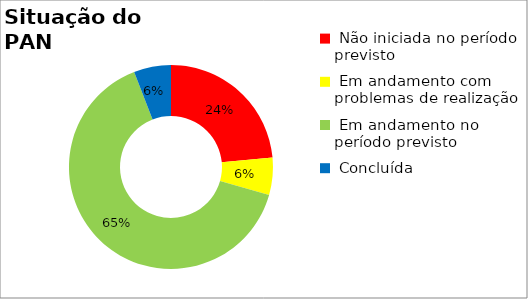
| Category | Series 0 |
|---|---|
|  Início planejado é posterior ao período monitorado | 0 |
|  Não iniciada no período previsto | 0.235 |
|  Em andamento com problemas de realização | 0.059 |
|  Em andamento no período previsto  | 0.647 |
|  Concluída | 0.059 |
|  Ações Novas - Pós monitoria | 0 |